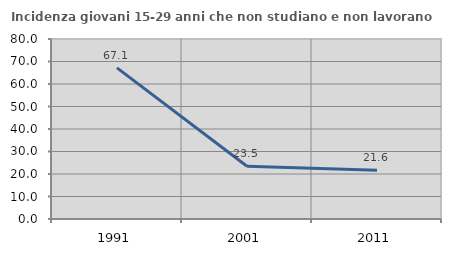
| Category | Incidenza giovani 15-29 anni che non studiano e non lavorano  |
|---|---|
| 1991.0 | 67.15 |
| 2001.0 | 23.46 |
| 2011.0 | 21.642 |